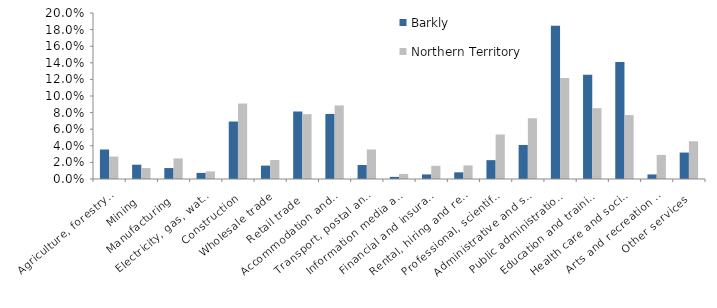
| Category | Barkly | Northern Territory |
|---|---|---|
| Agriculture, forestry and fishing | 0.036 | 0.027 |
| Mining | 0.017 | 0.013 |
| Manufacturing | 0.013 | 0.025 |
| Electricity, gas, water and waste services | 0.007 | 0.009 |
| Construction | 0.069 | 0.091 |
| Wholesale trade | 0.016 | 0.023 |
| Retail trade | 0.081 | 0.078 |
| Accommodation and food services | 0.078 | 0.089 |
| Transport, postal and warehousing | 0.017 | 0.036 |
| Information media and telecommunications | 0.003 | 0.006 |
| Financial and insurance services | 0.005 | 0.016 |
| Rental, hiring and real estate services | 0.008 | 0.016 |
| Professional, scientific and technical services | 0.023 | 0.054 |
| Administrative and support services | 0.041 | 0.073 |
| Public administration and safety | 0.185 | 0.122 |
| Education and training | 0.126 | 0.085 |
| Health care and social assistance | 0.141 | 0.077 |
| Arts and recreation services | 0.005 | 0.029 |
| Other services | 0.032 | 0.045 |